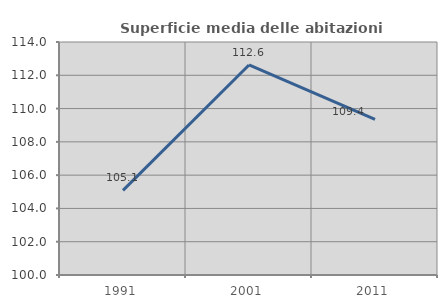
| Category | Superficie media delle abitazioni occupate |
|---|---|
| 1991.0 | 105.081 |
| 2001.0 | 112.621 |
| 2011.0 | 109.357 |